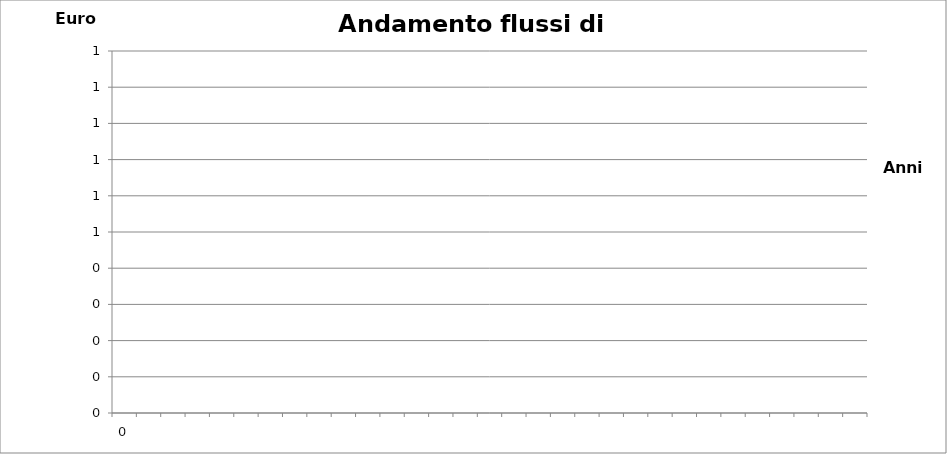
| Category | Series 0 | Series 3 |
|---|---|---|
| 0 | 0 | 0 |